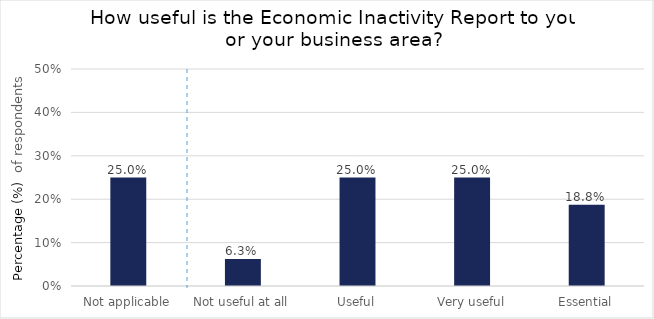
| Category | How useful is Economic Inactivity Paper to you or your business area? |
|---|---|
| Not applicable | 0.25 |
| Not useful at all | 0.062 |
| Useful | 0.25 |
| Very useful | 0.25 |
| Essential | 0.188 |